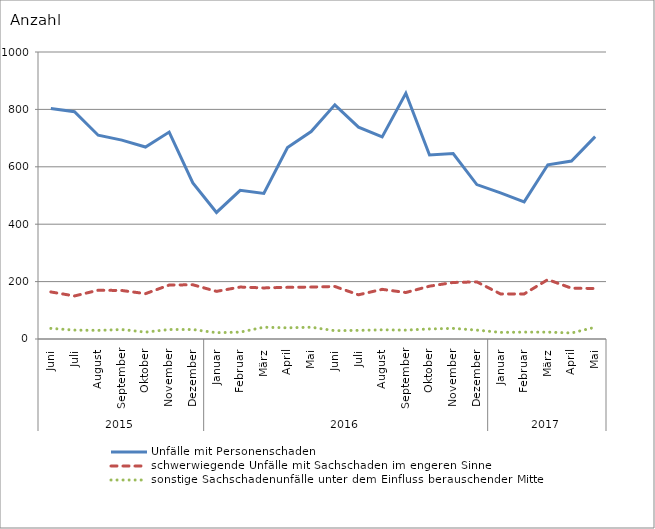
| Category | Unfälle mit Personenschaden | schwerwiegende Unfälle mit Sachschaden im engeren Sinne | sonstige Sachschadenunfälle unter dem Einfluss berauschender Mittel |
|---|---|---|---|
| 0 | 803 | 164 | 37 |
| 1 | 792 | 150 | 31 |
| 2 | 710 | 170 | 30 |
| 3 | 693 | 169 | 33 |
| 4 | 669 | 158 | 24 |
| 5 | 721 | 188 | 33 |
| 6 | 544 | 189 | 33 |
| 7 | 441 | 166 | 22 |
| 8 | 518 | 181 | 24 |
| 9 | 507 | 178 | 41 |
| 10 | 667 | 180 | 39 |
| 11 | 723 | 181 | 41 |
| 12 | 816 | 183 | 29 |
| 13 | 738 | 154 | 30 |
| 14 | 704 | 173 | 32 |
| 15 | 856 | 162 | 31 |
| 16 | 641 | 184 | 35 |
| 17 | 646 | 197 | 37 |
| 18 | 538 | 199 | 31 |
| 19 | 509 | 157 | 23 |
| 20 | 478 | 157 | 24 |
| 21 | 607 | 207 | 24 |
| 22 | 620 | 177 | 21 |
| 23 | 705 | 176 | 41 |